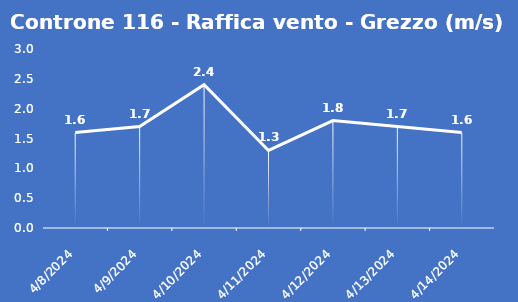
| Category | Controne 116 - Raffica vento - Grezzo (m/s) |
|---|---|
| 4/8/24 | 1.6 |
| 4/9/24 | 1.7 |
| 4/10/24 | 2.4 |
| 4/11/24 | 1.3 |
| 4/12/24 | 1.8 |
| 4/13/24 | 1.7 |
| 4/14/24 | 1.6 |